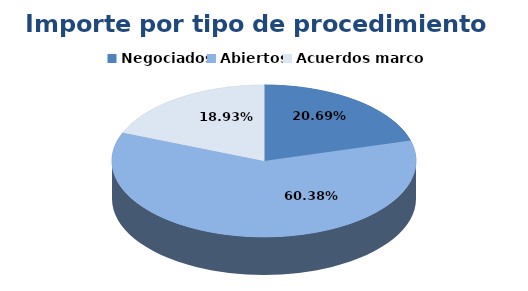
| Category | Series 0 |
|---|---|
| Negociados | 639500 |
| Abiertos | 1866272.73 |
| Acuerdos marco | 585287.16 |